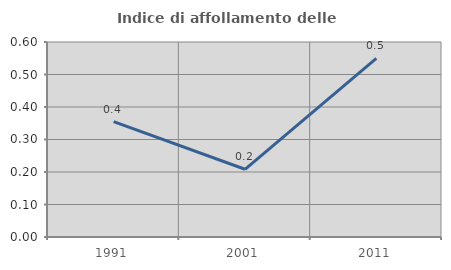
| Category | Indice di affollamento delle abitazioni  |
|---|---|
| 1991.0 | 0.355 |
| 2001.0 | 0.208 |
| 2011.0 | 0.55 |